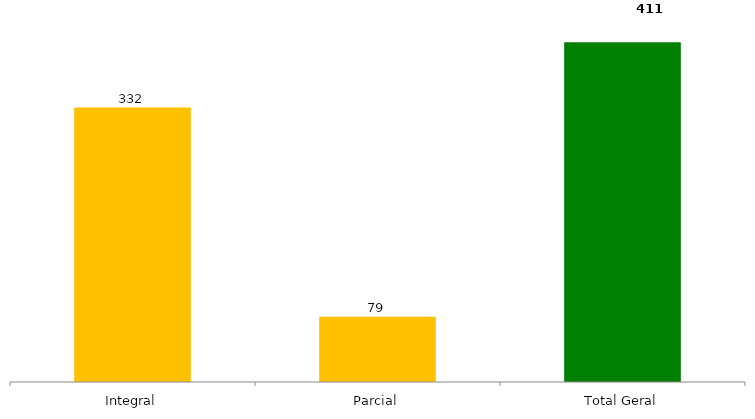
| Category | Categoria/Ano |
|---|---|
| Integral | 332 |
| Parcial | 79 |
| Total Geral | 411 |